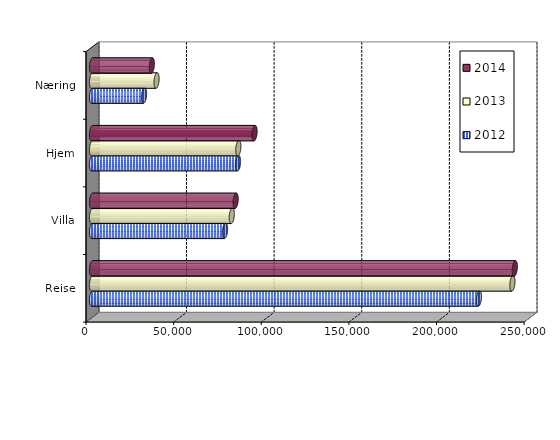
| Category | 2012 | 2013 | 2014 |
|---|---|---|---|
| Reise | 220772.455 | 239879 | 241255 |
| Villa | 75898.023 | 79751 | 81975 |
| Hjem | 83319.354 | 83488 | 92758 |
| Næring | 29692.208 | 36845.404 | 34143 |